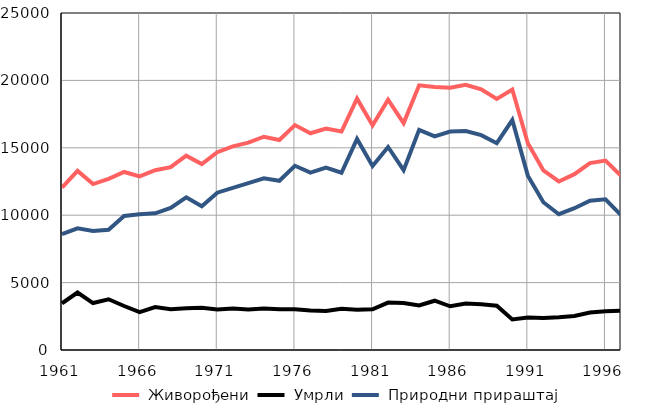
| Category |  Живорођени |  Умрли |  Природни прираштај |
|---|---|---|---|
| 1961.0 | 12053 | 3462 | 8591 |
| 1962.0 | 13289 | 4264 | 9025 |
| 1963.0 | 12308 | 3482 | 8826 |
| 1964.0 | 12691 | 3766 | 8925 |
| 1965.0 | 13206 | 3265 | 9941 |
| 1966.0 | 12882 | 2813 | 10069 |
| 1967.0 | 13334 | 3191 | 10143 |
| 1968.0 | 13561 | 3016 | 10545 |
| 1969.0 | 14420 | 3097 | 11323 |
| 1970.0 | 13794 | 3131 | 10663 |
| 1971.0 | 14673 | 3002 | 11671 |
| 1972.0 | 15104 | 3080 | 12024 |
| 1973.0 | 15384 | 3000 | 12384 |
| 1974.0 | 15821 | 3087 | 12734 |
| 1975.0 | 15574 | 3020 | 12554 |
| 1976.0 | 16686 | 3018 | 13668 |
| 1977.0 | 16079 | 2925 | 13154 |
| 1978.0 | 16425 | 2894 | 13531 |
| 1979.0 | 16205 | 3054 | 13151 |
| 1980.0 | 18648 | 2991 | 15657 |
| 1981.0 | 16670 | 3018 | 13652 |
| 1982.0 | 18574 | 3515 | 15059 |
| 1983.0 | 16830 | 3485 | 13345 |
| 1984.0 | 19637 | 3303 | 16334 |
| 1985.0 | 19507 | 3655 | 15852 |
| 1986.0 | 19450 | 3243 | 16207 |
| 1987.0 | 19680 | 3441 | 16239 |
| 1988.0 | 19342 | 3401 | 15941 |
| 1989.0 | 18623 | 3284 | 15339 |
| 1990.0 | 19325 | 2265 | 17060 |
| 1991.0 | 15342 | 2408 | 12934 |
| 1992.0 | 13330 | 2371 | 10959 |
| 1993.0 | 12503 | 2430 | 10073 |
| 1994.0 | 13044 | 2527 | 10517 |
| 1995.0 | 13866 | 2786 | 11080 |
| 1996.0 | 14049 | 2872 | 11177 |
| 1997.0 | 12923 | 2921 | 10002 |